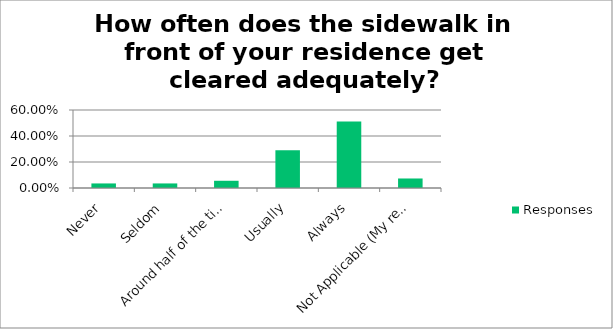
| Category | Responses |
|---|---|
| Never | 0.035 |
| Seldom | 0.035 |
| Around half of the time | 0.056 |
| Usually | 0.29 |
| Always | 0.511 |
| Not Applicable (My residence does not have a sidewalk) | 0.073 |